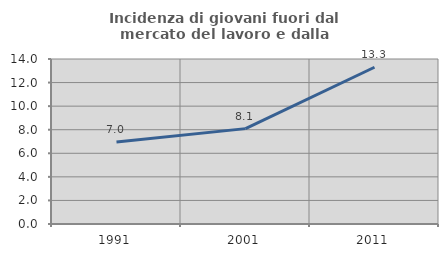
| Category | Incidenza di giovani fuori dal mercato del lavoro e dalla formazione  |
|---|---|
| 1991.0 | 6.956 |
| 2001.0 | 8.093 |
| 2011.0 | 13.301 |